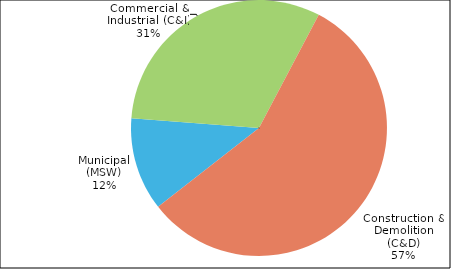
| Category | Series 0 |
|---|---|
| Municipal (MSW) | 1176997.64 |
| Commercial & Industrial (C&I) | 3147150.63 |
| Construction & Demolition (C&D) | 5664541.15 |